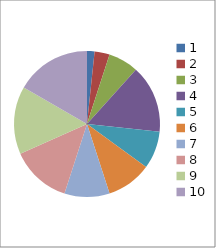
| Category | Series 0 |
|---|---|
| 0 | 1 |
| 1 | 2 |
| 2 | 4 |
| 3 | 9 |
| 4 | 5 |
| 5 | 6 |
| 6 | 6 |
| 7 | 8 |
| 8 | 9 |
| 9 | 10 |